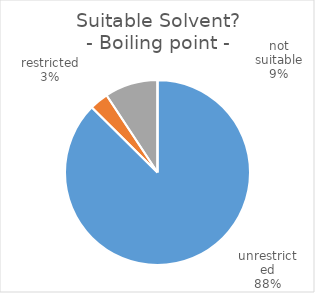
| Category | Series 0 |
|---|---|
| 0 | 160 |
| 1 | 6 |
| 2 | 17 |
| 3 | 0 |